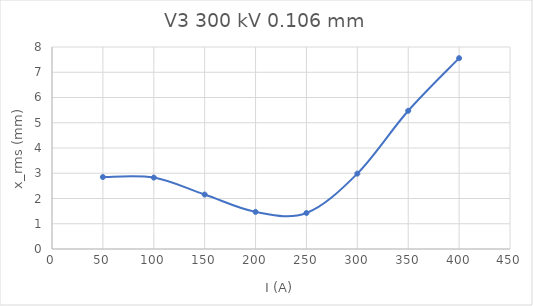
| Category | Series 0 |
|---|---|
| 50.0 | 2.85 |
| 100.0 | 2.829 |
| 150.0 | 2.157 |
| 200.0 | 1.47 |
| 250.0 | 1.427 |
| 300.0 | 2.985 |
| 350.0 | 5.474 |
| 400.0 | 7.558 |